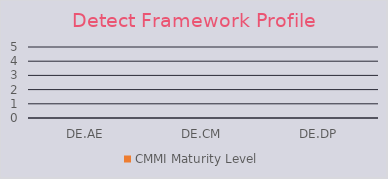
| Category | CMMI Maturity Level |
|---|---|
| DE.AE | 0 |
| DE.CM | 0 |
| DE.DP | 0 |